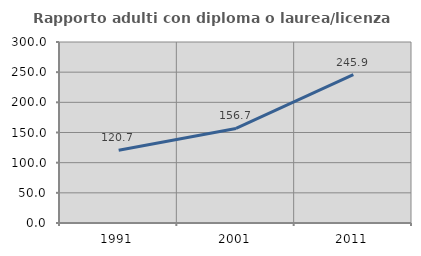
| Category | Rapporto adulti con diploma o laurea/licenza media  |
|---|---|
| 1991.0 | 120.69 |
| 2001.0 | 156.716 |
| 2011.0 | 245.921 |